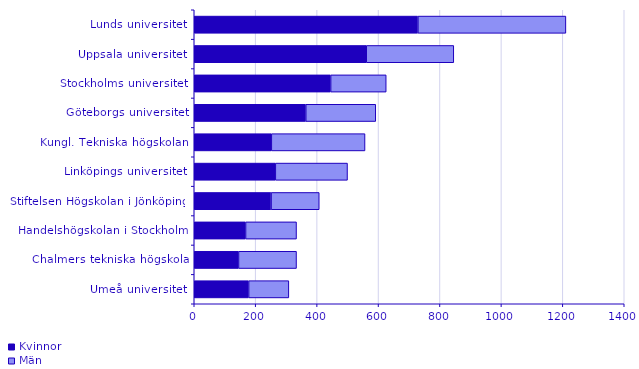
| Category | Kvinnor | Män |
|---|---|---|
| Umeå universitet | 177 | 131 |
| Chalmers tekniska högskola | 144 | 189 |
| Handelshögskolan i Stockholm | 167 | 166 |
| Stiftelsen Högskolan i Jönköping | 250 | 157 |
| Linköpings universitet | 264 | 235 |
| Kungl. Tekniska högskolan | 251 | 305 |
| Göteborgs universitet | 363 | 228 |
| Stockholms universitet | 444 | 181 |
| Uppsala universitet | 560 | 285 |
| Lunds universitet | 728 | 482 |